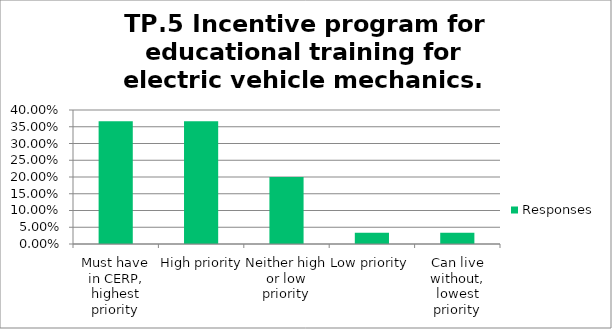
| Category | Responses |
|---|---|
| Must have in CERP, highest priority | 0.367 |
| High priority | 0.367 |
| Neither high or low priority | 0.2 |
| Low priority | 0.033 |
| Can live without, lowest priority | 0.033 |